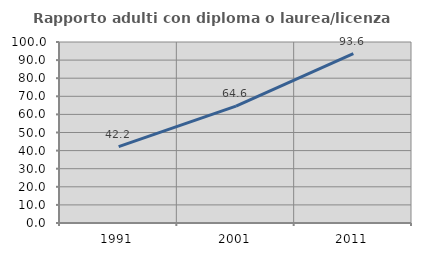
| Category | Rapporto adulti con diploma o laurea/licenza media  |
|---|---|
| 1991.0 | 42.164 |
| 2001.0 | 64.607 |
| 2011.0 | 93.639 |